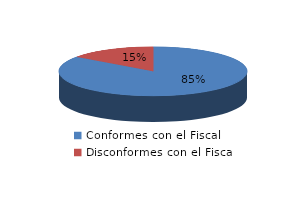
| Category | Series 0 |
|---|---|
| 0 | 57 |
| 1 | 10 |